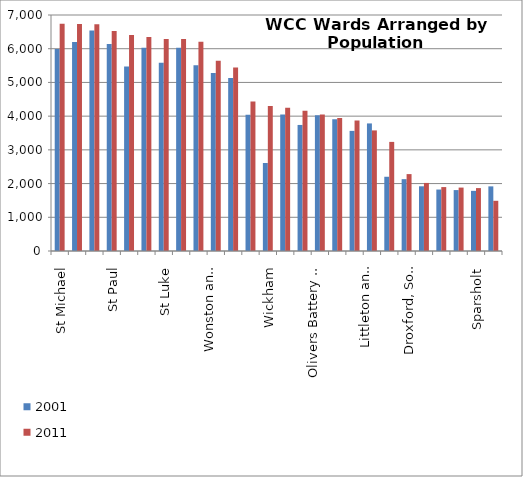
| Category | 2001 | 2011 |
|---|---|---|
| St Michael | 5993 | 6740 |
| Denmead | 6197 | 6736 |
| Bishops Waltham | 6538 | 6723 |
| St Paul | 6137 | 6522 |
| St Bartholomew | 5471 | 6407 |
| The Alresfords | 6029 | 6349 |
| St Luke | 5584 | 6290 |
| St John and All Saints | 6030 | 6285 |
| St Barnabas | 5510 | 6205 |
| Wonston and Micheldever | 5281 | 5644 |
| Colden Common and Twyford | 5131 | 5446 |
| Kings Worthy | 4044 | 4435 |
| Wickham | 2610 | 4299 |
| Swanmore and Newtown | 4052 | 4251 |
| Compton and Otterbourne | 3739 | 4157 |
| Olivers Battery and Badger Farm | 4027 | 4048 |
| Shedfield | 3911 | 3942 |
| Owslebury and Curdridge | 3563 | 3871 |
| Littleton and Harestock | 3784 | 3577 |
| Whiteley | 2202 | 3236 |
| Cheriton and Bishops Sutton | 2131 | 2281 |
| Droxford, Soberton and Hambledon | 1919 | 2019 |
| Itchen Valley | 1823 | 1896 |
| Upper Meon Valley | 1807 | 1881 |
| Sparsholt | 1784 | 1866 |
| Boarhunt and Southwick | 1917 | 1489 |